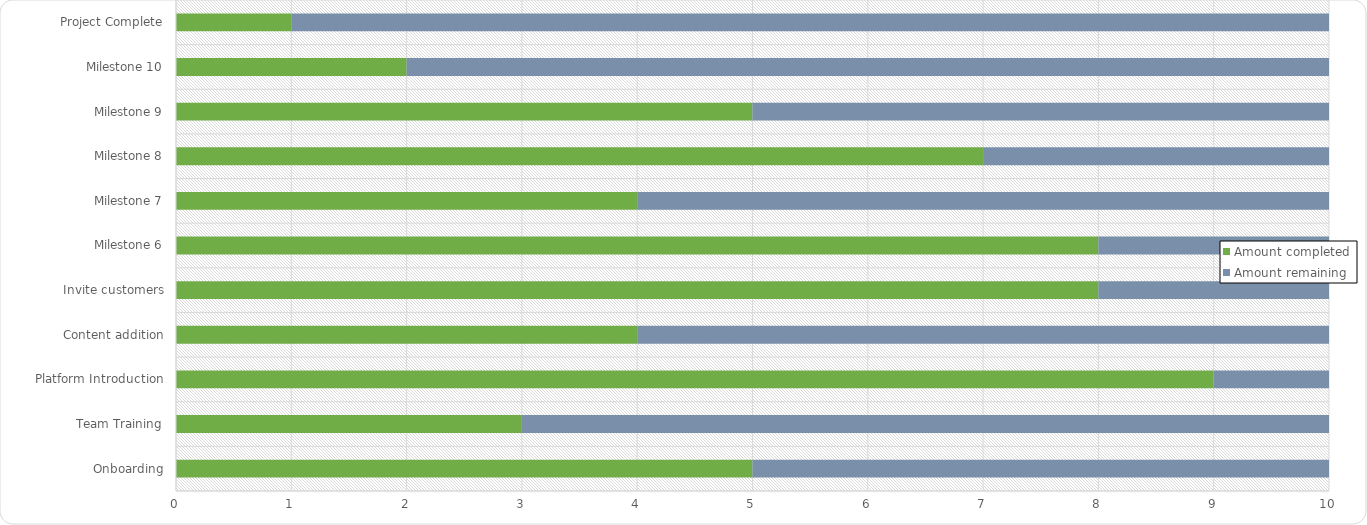
| Category | Amount completed | Amount remaining |
|---|---|---|
| Onboarding | 5 | 5 |
| Team Training | 3 | 7 |
| Platform Introduction | 9 | 1 |
| Content addition | 4 | 6 |
| Invite customers | 8 | 2 |
| Milestone 6 | 8 | 2 |
| Milestone 7 | 4 | 6 |
| Milestone 8 | 7 | 3 |
| Milestone 9 | 5 | 5 |
| Milestone 10 | 2 | 8 |
| Project Complete | 1 | 9 |